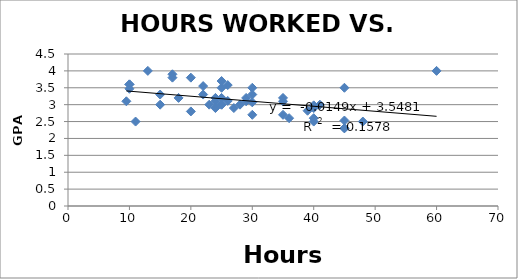
| Category | Series 0 |
|---|---|
| 40.0 | 2.9 |
| 30.0 | 3.5 |
| 26.0 | 3.58 |
| 41.0 | 3 |
| 40.0 | 2.98 |
| 60.0 | 4 |
| 9.5 | 3.1 |
| 25.0 | 3.5 |
| 40.0 | 2.5 |
| 35.0 | 2.7 |
| 45.0 | 2.3 |
| 10.0 | 3.6 |
| 25.0 | 3 |
| 27.0 | 2.9 |
| 39.0 | 2.82 |
| 25.0 | 3.2 |
| 15.0 | 3.3 |
| 22.0 | 3.55 |
| 20.0 | 3.8 |
| 30.0 | 3.07 |
| 13.0 | 4 |
| 29.0 | 3.1 |
| 23.0 | 3 |
| 10.0 | 3.47 |
| 45.0 | 2.53 |
| 35.0 | 3.1 |
| 25.0 | 3 |
| 24.0 | 3.2 |
| 28.0 | 3 |
| 30.0 | 2.7 |
| 45.0 | 3.5 |
| 11.0 | 2.5 |
| 25.0 | 3.7 |
| 35.0 | 3.2 |
| 40.0 | 2.6 |
| 45.0 | 2.3 |
| 15.0 | 3 |
| 30.0 | 3.3 |
| 24.0 | 2.9 |
| 36.0 | 2.6 |
| 18.0 | 3.2 |
| 22.0 | 3.3 |
| 29.0 | 3.2 |
| 17.0 | 3.8 |
| 26.0 | 3.11 |
| 17.0 | 3.9 |
| 24.0 | 3.1 |
| 20.0 | 2.8 |
| 10.0 | 3.6 |
| 48.0 | 2.5 |